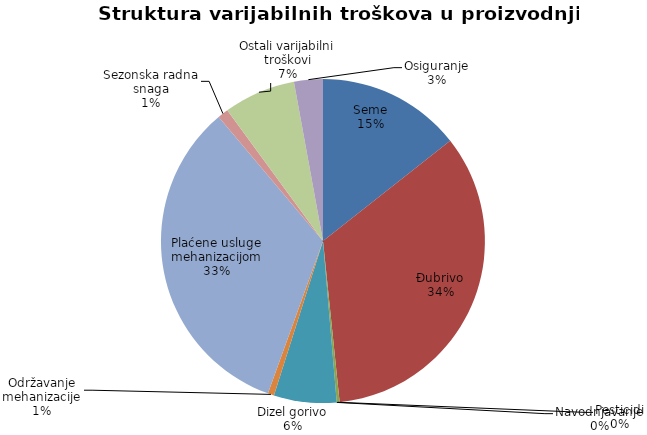
| Category | Series 0 |
|---|---|
| Seme | 10000 |
| Đubrivo | 23650 |
| Pesticidi | 200 |
| Navodnjavanje | 0 |
| Dizel gorivo | 4350 |
| Održavanje mehanizacije | 432.692 |
| Plaćene usluge mehanizacijom | 23200 |
| Sezonska radna snaga | 750 |
| Ostali varijabilni troškovi | 5000 |
| Osiguranje | 2000 |